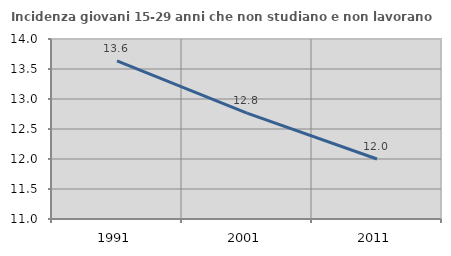
| Category | Incidenza giovani 15-29 anni che non studiano e non lavorano  |
|---|---|
| 1991.0 | 13.636 |
| 2001.0 | 12.766 |
| 2011.0 | 12 |